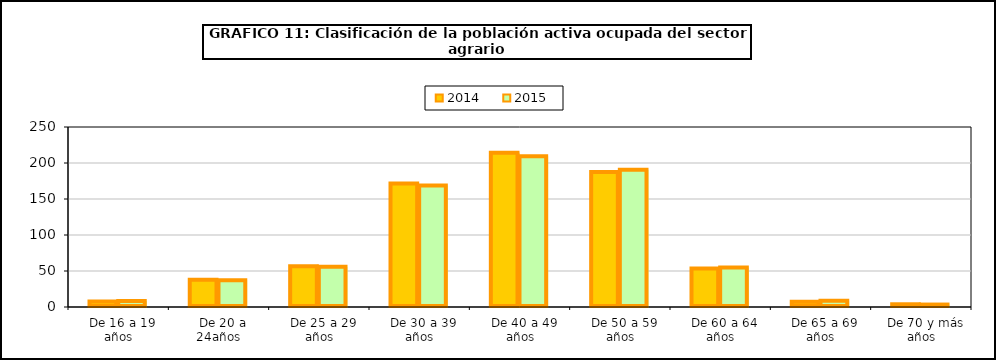
| Category | 2014 | 2015 |
|---|---|---|
|   De 16 a 19 años | 7.7 | 8.4 |
|   De 20 a 24años | 37.7 | 37.275 |
|   De 25 a 29 años | 56.6 | 56.025 |
|   De 30 a 39 años | 171.7 | 168.65 |
|   De 40 a 49 años | 214.2 | 209.275 |
|   De 50 a 59 años | 187.5 | 190.475 |
|   De 60 a 64 años | 53.6 | 54.725 |
|   De 65 a 69 años | 7.2 | 8.6 |
|   De 70 y más años | 3.8 | 3.4 |